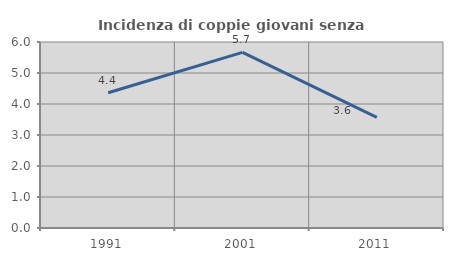
| Category | Incidenza di coppie giovani senza figli |
|---|---|
| 1991.0 | 4.361 |
| 2001.0 | 5.666 |
| 2011.0 | 3.571 |